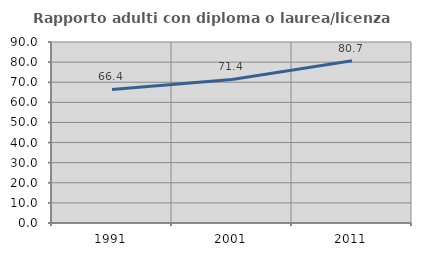
| Category | Rapporto adulti con diploma o laurea/licenza media  |
|---|---|
| 1991.0 | 66.389 |
| 2001.0 | 71.359 |
| 2011.0 | 80.668 |